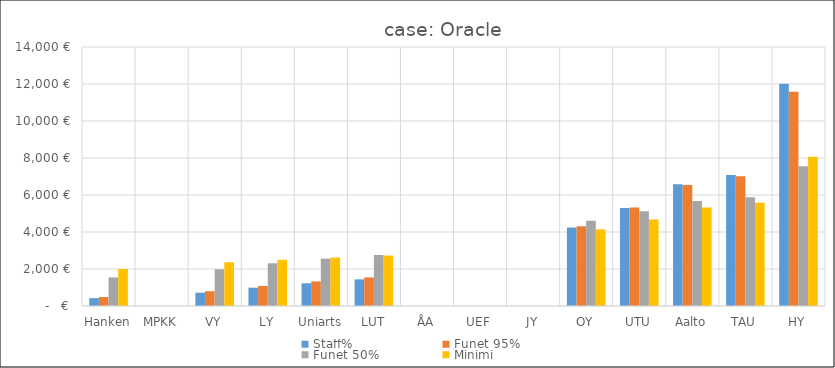
| Category | Staff% | Funet 95% | Funet 50% | Minimi |
|---|---|---|---|---|
| Hanken | 424.319 | 483.787 | 1544.266 | 2000 |
| MPKK | 0 | 0 | 0 | 0 |
| VY | 719.809 | 799.288 | 1984.935 | 2363.763 |
| LY | 991.467 | 1083.455 | 2311.001 | 2501.049 |
| Uniarts | 1229.459 | 1329.153 | 2559.659 | 2621.32 |
| LUT | 1439.452 | 1543.952 | 2758.746 | 2727.443 |
| ÅA | 0 | 0 | 0 | 0 |
| UEF | 0 | 0 | 0 | 0 |
| JY | 0 | 0 | 0 | 0 |
| OY | 4240.692 | 4309.346 | 4608.934 | 4143.08 |
| UTU | 5292.99 | 5319.399 | 5120.661 | 4674.87 |
| Aalto | 6579.114 | 6540.418 | 5678.028 | 5324.827 |
| TAU | 7074.931 | 7007.814 | 5877.411 | 5575.393 |
| HY | 12007.766 | 11583.388 | 7556.359 | 8068.255 |